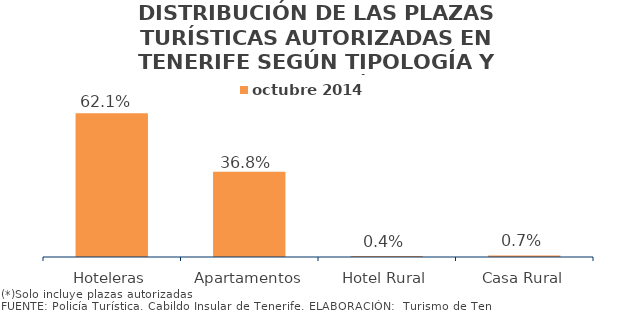
| Category | octubre 2014 |
|---|---|
| Hoteleras | 0.621 |
| Apartamentos | 0.368 |
| Hotel Rural | 0.004 |
| Casa Rural | 0.007 |